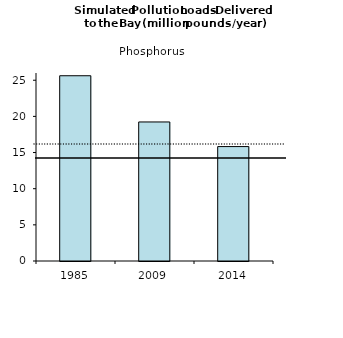
| Category | Series 0 |
|---|---|
| 1985.0 | 25.621 |
| 2009.0 | 19.229 |
| 2014.0 | 15.825 |